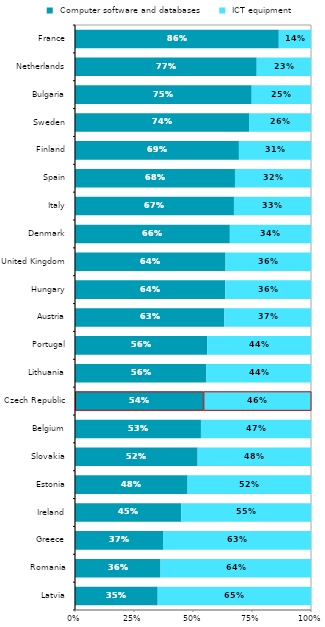
| Category |  Computer software and databases |  ICT equipment |
|---|---|---|
| Latvia | 0.35 | 0.65 |
| Romania | 0.362 | 0.638 |
| Greece | 0.373 | 0.627 |
| Ireland | 0.45 | 0.55 |
| Estonia | 0.477 | 0.523 |
| Slovakia | 0.519 | 0.481 |
| Belgium | 0.534 | 0.466 |
| Czech Republic | 0.544 | 0.456 |
| Lithuania | 0.557 | 0.443 |
| Portugal | 0.56 | 0.44 |
| Austria | 0.633 | 0.367 |
| Hungary | 0.637 | 0.363 |
| United Kingdom | 0.638 | 0.362 |
| Denmark | 0.656 | 0.344 |
| Italy | 0.673 | 0.327 |
| Spain | 0.678 | 0.322 |
| Finland | 0.694 | 0.306 |
| Sweden | 0.738 | 0.262 |
| Bulgaria | 0.749 | 0.251 |
| Netherlands | 0.77 | 0.23 |
| France | 0.864 | 0.136 |